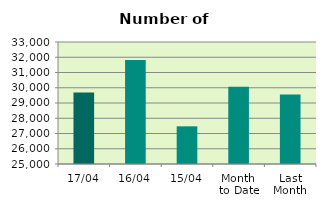
| Category | Series 0 |
|---|---|
| 17/04 | 29688 |
| 16/04 | 31814 |
| 15/04 | 27470 |
| Month 
to Date | 30071.846 |
| Last
Month | 29553.143 |